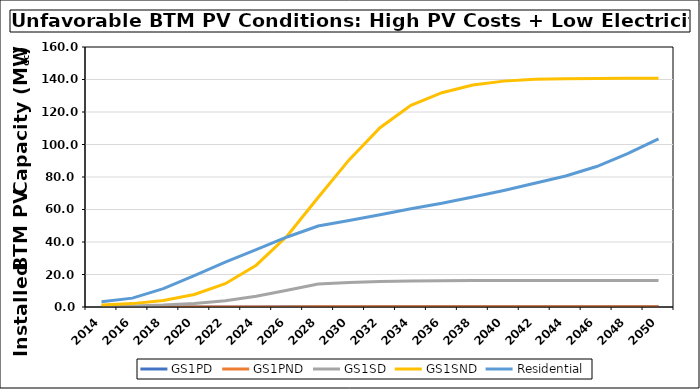
| Category | GS1PD | GS1PND | GS1SD | GS1SND | Residential |
|---|---|---|---|---|---|
| 2014.0 | 0 | 0 | 0.382 | 1.269 | 3.168 |
| 2016.0 | 0 | 0 | 0.615 | 2.079 | 5.467 |
| 2018.0 | 0.006 | 0.002 | 1.161 | 4.051 | 11.301 |
| 2020.0 | 0.016 | 0.007 | 2.158 | 7.716 | 19.358 |
| 2022.0 | 0.034 | 0.014 | 3.881 | 14.336 | 27.658 |
| 2024.0 | 0.063 | 0.027 | 6.568 | 25.739 | 35.291 |
| 2026.0 | 0.11 | 0.049 | 10.286 | 43.678 | 43.091 |
| 2028.0 | 0.17 | 0.079 | 14.115 | 67.421 | 49.833 |
| 2030.0 | 0.208 | 0.108 | 15.073 | 90.518 | 53.209 |
| 2032.0 | 0.24 | 0.134 | 15.735 | 110.34 | 56.828 |
| 2034.0 | 0.262 | 0.153 | 16.046 | 124.11 | 60.454 |
| 2036.0 | 0.272 | 0.164 | 16.162 | 131.887 | 63.834 |
| 2038.0 | 0.28 | 0.171 | 16.238 | 136.637 | 67.674 |
| 2040.0 | 0.284 | 0.174 | 16.269 | 138.998 | 71.685 |
| 2042.0 | 0.286 | 0.176 | 16.283 | 140.129 | 76.135 |
| 2044.0 | 0.286 | 0.177 | 16.285 | 140.46 | 80.619 |
| 2046.0 | 0.287 | 0.177 | 16.287 | 140.619 | 86.437 |
| 2048.0 | 0.287 | 0.178 | 16.288 | 140.776 | 94.341 |
| 2050.0 | 0.287 | 0.178 | 16.289 | 140.828 | 103.428 |